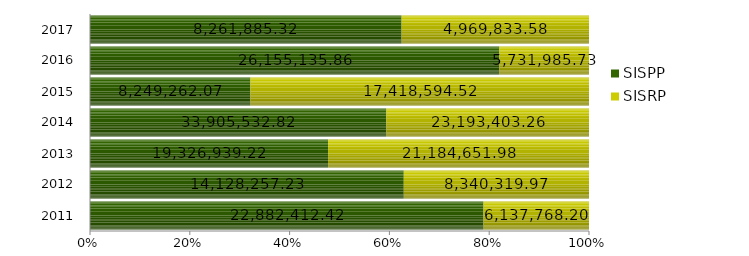
| Category | SISPP | SISRP |
|---|---|---|
| 2011.0 | 22882412.42 | 6137768.2 |
| 2012.0 | 14128257.23 | 8340319.97 |
| 2013.0 | 19326939.22 | 21184651.98 |
| 2014.0 | 33905532.82 | 23193403.26 |
| 2015.0 | 8249262.07 | 17418594.52 |
| 2016.0 | 26155135.86 | 5731985.73 |
| 2017.0 | 8261885.32 | 4969833.58 |